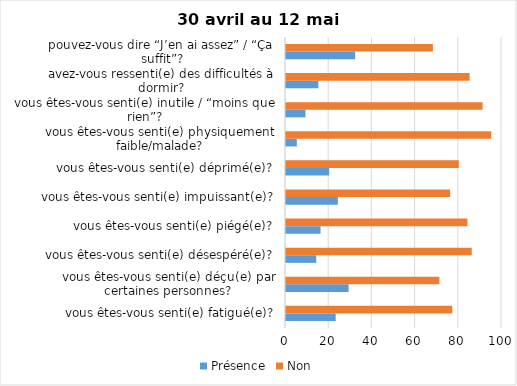
| Category | Présence | Non |
|---|---|---|
| vous êtes-vous senti(e) fatigué(e)? | 23 | 77 |
| vous êtes-vous senti(e) déçu(e) par certaines personnes? | 29 | 71 |
| vous êtes-vous senti(e) désespéré(e)? | 14 | 86 |
| vous êtes-vous senti(e) piégé(e)? | 16 | 84 |
| vous êtes-vous senti(e) impuissant(e)? | 24 | 76 |
| vous êtes-vous senti(e) déprimé(e)? | 20 | 80 |
| vous êtes-vous senti(e) physiquement faible/malade? | 5 | 95 |
| vous êtes-vous senti(e) inutile / “moins que rien”? | 9 | 91 |
| avez-vous ressenti(e) des difficultés à dormir? | 15 | 85 |
| pouvez-vous dire “J’en ai assez” / “Ça suffit”? | 32 | 68 |